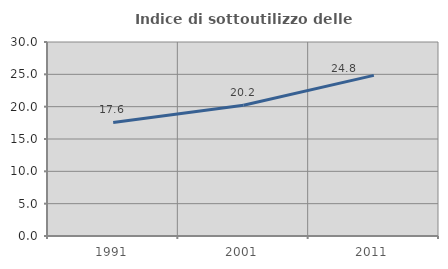
| Category | Indice di sottoutilizzo delle abitazioni  |
|---|---|
| 1991.0 | 17.568 |
| 2001.0 | 20.222 |
| 2011.0 | 24.838 |